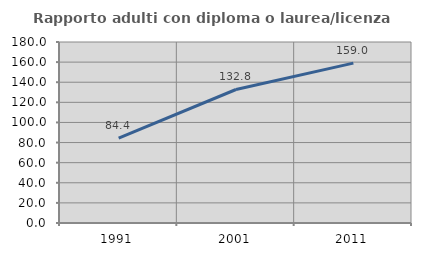
| Category | Rapporto adulti con diploma o laurea/licenza media  |
|---|---|
| 1991.0 | 84.434 |
| 2001.0 | 132.773 |
| 2011.0 | 158.964 |